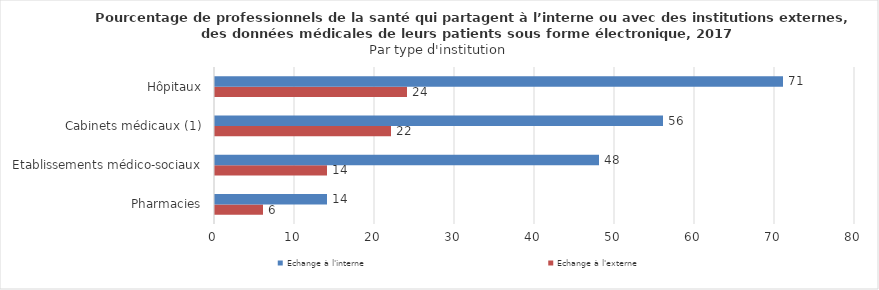
| Category | Echange à l'externe  | Echange à l'interne |
|---|---|---|
| Pharmacies | 6 | 14 |
| Etablissements médico-sociaux | 14 | 48 |
| Cabinets médicaux (1) | 22 | 56 |
| Hôpitaux | 24 | 71 |